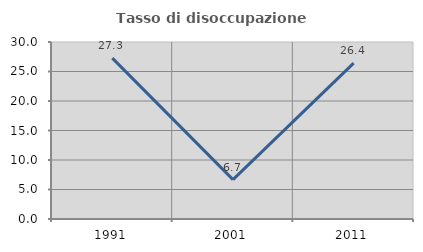
| Category | Tasso di disoccupazione giovanile  |
|---|---|
| 1991.0 | 27.273 |
| 2001.0 | 6.667 |
| 2011.0 | 26.415 |